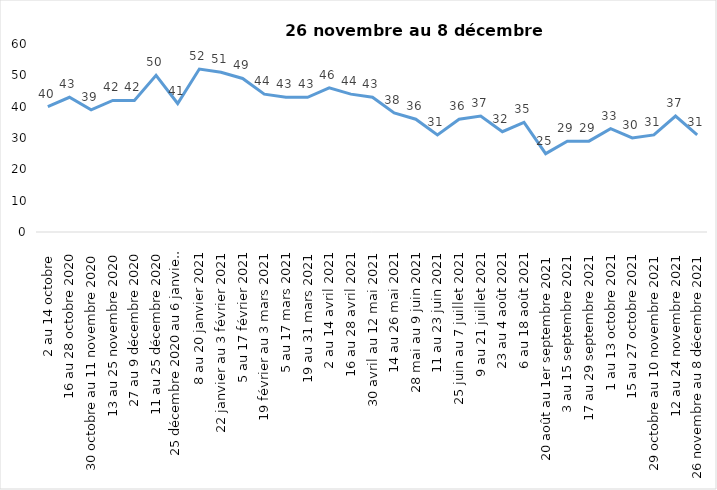
| Category | Toujours aux trois mesures |
|---|---|
| 2 au 14 octobre  | 40 |
| 16 au 28 octobre 2020 | 43 |
| 30 octobre au 11 novembre 2020 | 39 |
| 13 au 25 novembre 2020 | 42 |
| 27 au 9 décembre 2020 | 42 |
| 11 au 25 décembre 2020 | 50 |
| 25 décembre 2020 au 6 janvier 2021 | 41 |
| 8 au 20 janvier 2021 | 52 |
| 22 janvier au 3 février 2021 | 51 |
| 5 au 17 février 2021 | 49 |
| 19 février au 3 mars 2021 | 44 |
| 5 au 17 mars 2021 | 43 |
| 19 au 31 mars 2021 | 43 |
| 2 au 14 avril 2021 | 46 |
| 16 au 28 avril 2021 | 44 |
| 30 avril au 12 mai 2021 | 43 |
| 14 au 26 mai 2021 | 38 |
| 28 mai au 9 juin 2021 | 36 |
| 11 au 23 juin 2021 | 31 |
| 25 juin au 7 juillet 2021 | 36 |
| 9 au 21 juillet 2021 | 37 |
| 23 au 4 août 2021 | 32 |
| 6 au 18 août 2021 | 35 |
| 20 août au 1er septembre 2021 | 25 |
| 3 au 15 septembre 2021 | 29 |
| 17 au 29 septembre 2021 | 29 |
| 1 au 13 octobre 2021 | 33 |
| 15 au 27 octobre 2021 | 30 |
| 29 octobre au 10 novembre 2021 | 31 |
| 12 au 24 novembre 2021 | 37 |
| 26 novembre au 8 décembre 2021 | 31 |